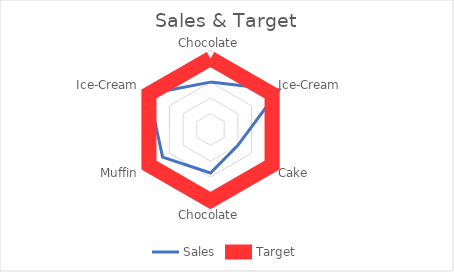
| Category | Sales | Target |
|---|---|---|
| Chocolate | 6000 | 9000 |
| Ice-Cream | 10000 | 9000 |
| Cake | 4000 | 9000 |
| Chocolate | 5500 | 9000 |
| Muffin | 7000 | 9000 |
| Ice-Cream | 9000 | 9000 |